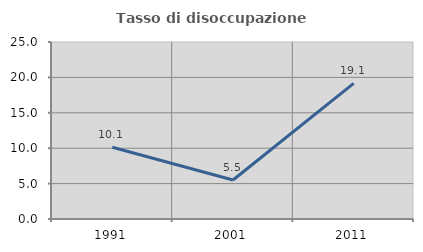
| Category | Tasso di disoccupazione giovanile  |
|---|---|
| 1991.0 | 10.131 |
| 2001.0 | 5.502 |
| 2011.0 | 19.149 |